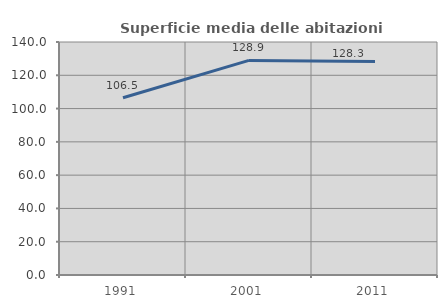
| Category | Superficie media delle abitazioni occupate |
|---|---|
| 1991.0 | 106.484 |
| 2001.0 | 128.943 |
| 2011.0 | 128.293 |